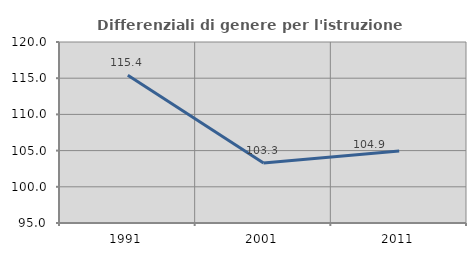
| Category | Differenziali di genere per l'istruzione superiore |
|---|---|
| 1991.0 | 115.418 |
| 2001.0 | 103.28 |
| 2011.0 | 104.935 |